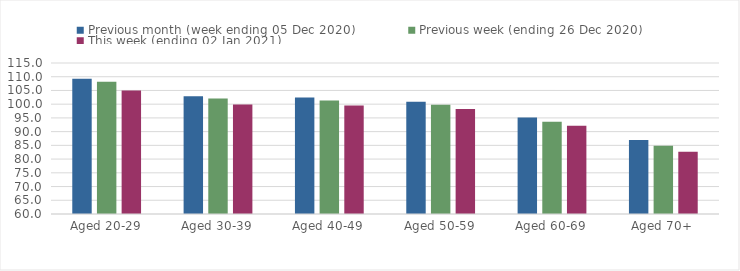
| Category | Previous month (week ending 05 Dec 2020) | Previous week (ending 26 Dec 2020) | This week (ending 02 Jan 2021) |
|---|---|---|---|
| Aged 20-29 | 109.27 | 108.21 | 104.95 |
| Aged 30-39 | 102.91 | 102.09 | 99.87 |
| Aged 40-49 | 102.47 | 101.37 | 99.54 |
| Aged 50-59 | 100.88 | 99.79 | 98.2 |
| Aged 60-69 | 95.15 | 93.64 | 92.11 |
| Aged 70+ | 86.98 | 84.89 | 82.69 |